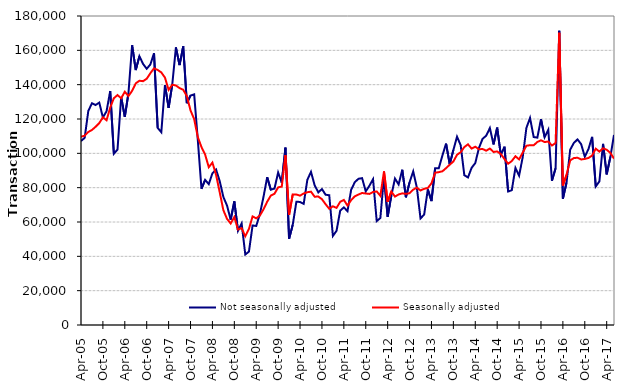
| Category | Not seasonally adjusted | Seasonally adjusted |
|---|---|---|
| 2005-04-01 | 107190 | 109680 |
| 2005-05-01 | 109010 | 110270 |
| 2005-06-01 | 124660 | 112460 |
| 2005-07-01 | 129170 | 113610 |
| 2005-08-01 | 128150 | 115470 |
| 2005-09-01 | 129560 | 117590 |
| 2005-10-01 | 120860 | 120990 |
| 2005-11-01 | 124540 | 119270 |
| 2005-12-01 | 136300 | 126640 |
| 2006-01-01 | 99740 | 132100 |
| 2006-02-01 | 102230 | 133940 |
| 2006-03-01 | 132710 | 132080 |
| 2006-04-01 | 121270 | 135880 |
| 2006-05-01 | 135030 | 133370 |
| 2006-06-01 | 162970 | 136400 |
| 2006-07-01 | 148490 | 140770 |
| 2006-08-01 | 156560 | 142280 |
| 2006-09-01 | 152100 | 142030 |
| 2006-10-01 | 149270 | 143440 |
| 2006-11-01 | 151770 | 146670 |
| 2006-12-01 | 158310 | 149510 |
| 2007-01-01 | 114880 | 148580 |
| 2007-02-01 | 112280 | 147120 |
| 2007-03-01 | 139780 | 144110 |
| 2007-04-01 | 126450 | 136980 |
| 2007-05-01 | 140110 | 139920 |
| 2007-06-01 | 161680 | 139530 |
| 2007-07-01 | 151390 | 137980 |
| 2007-08-01 | 162330 | 137040 |
| 2007-09-01 | 129210 | 133260 |
| 2007-10-01 | 133700 | 124980 |
| 2007-11-01 | 134320 | 119940 |
| 2007-12-01 | 107680 | 109440 |
| 2008-01-01 | 79350 | 103660 |
| 2008-02-01 | 84540 | 99300 |
| 2008-03-01 | 82050 | 91920 |
| 2008-04-01 | 88350 | 94610 |
| 2008-05-01 | 90570 | 87440 |
| 2008-06-01 | 83780 | 77280 |
| 2008-07-01 | 74560 | 66860 |
| 2008-08-01 | 69560 | 61820 |
| 2008-09-01 | 61330 | 59130 |
| 2008-10-01 | 72020 | 62890 |
| 2008-11-01 | 54910 | 55610 |
| 2008-12-01 | 59180 | 56400 |
| 2009-01-01 | 41060 | 51660 |
| 2009-02-01 | 42750 | 55930 |
| 2009-03-01 | 57990 | 63250 |
| 2009-04-01 | 57690 | 62120 |
| 2009-05-01 | 64640 | 63760 |
| 2009-06-01 | 74760 | 67390 |
| 2009-07-01 | 86090 | 71810 |
| 2009-08-01 | 78820 | 75400 |
| 2009-09-01 | 79480 | 76470 |
| 2009-10-01 | 88840 | 80170 |
| 2009-11-01 | 82910 | 80640 |
| 2009-12-01 | 103320 | 98940 |
| 2010-01-01 | 50230 | 64150 |
| 2010-02-01 | 58370 | 76080 |
| 2010-03-01 | 71830 | 76000 |
| 2010-04-01 | 71660 | 75360 |
| 2010-05-01 | 70560 | 76610 |
| 2010-06-01 | 84580 | 77340 |
| 2010-07-01 | 89190 | 77660 |
| 2010-08-01 | 81420 | 74740 |
| 2010-09-01 | 77250 | 74840 |
| 2010-10-01 | 79190 | 73270 |
| 2010-11-01 | 75890 | 70370 |
| 2010-12-01 | 75600 | 67700 |
| 2011-01-01 | 51900 | 69140 |
| 2011-02-01 | 54880 | 68230 |
| 2011-03-01 | 66600 | 71760 |
| 2011-04-01 | 68510 | 72870 |
| 2011-05-01 | 66340 | 69560 |
| 2011-06-01 | 78780 | 72780 |
| 2011-07-01 | 83180 | 74950 |
| 2011-08-01 | 85180 | 75980 |
| 2011-09-01 | 85530 | 76890 |
| 2011-10-01 | 77840 | 76610 |
| 2011-11-01 | 81110 | 76350 |
| 2011-12-01 | 84940 | 77470 |
| 2012-01-01 | 60530 | 77810 |
| 2012-02-01 | 62300 | 75240 |
| 2012-03-01 | 86720 | 89470 |
| 2012-04-01 | 63040 | 71730 |
| 2012-05-01 | 75350 | 77750 |
| 2012-06-01 | 85310 | 74800 |
| 2012-07-01 | 81880 | 76030 |
| 2012-08-01 | 90440 | 76690 |
| 2012-09-01 | 74390 | 76400 |
| 2012-10-01 | 83060 | 76770 |
| 2012-11-01 | 89450 | 78860 |
| 2012-12-01 | 80010 | 79990 |
| 2013-01-01 | 62060 | 78380 |
| 2013-02-01 | 64360 | 79340 |
| 2013-03-01 | 79000 | 79780 |
| 2013-04-01 | 72180 | 82520 |
| 2013-05-01 | 91270 | 88690 |
| 2013-06-01 | 91270 | 89040 |
| 2013-07-01 | 98710 | 89540 |
| 2013-08-01 | 105630 | 91380 |
| 2013-09-01 | 93680 | 93380 |
| 2013-10-01 | 101920 | 95230 |
| 2013-11-01 | 109670 | 99150 |
| 2013-12-01 | 104700 | 100660 |
| 2014-01-01 | 87280 | 103640 |
| 2014-02-01 | 85940 | 105230 |
| 2014-03-01 | 91570 | 102750 |
| 2014-04-01 | 94340 | 103850 |
| 2014-05-01 | 103110 | 102380 |
| 2014-06-01 | 108460 | 102520 |
| 2014-07-01 | 110280 | 101540 |
| 2014-08-01 | 114720 | 102790 |
| 2014-09-01 | 105170 | 100800 |
| 2014-10-01 | 114990 | 101110 |
| 2014-11-01 | 99010 | 99590 |
| 2014-12-01 | 103880 | 96680 |
| 2015-01-01 | 77750 | 93950 |
| 2015-02-01 | 78540 | 95500 |
| 2015-03-01 | 91490 | 98300 |
| 2015-04-01 | 86970 | 96460 |
| 2015-05-01 | 97800 | 100450 |
| 2015-06-01 | 114770 | 104410 |
| 2015-07-01 | 120610 | 104750 |
| 2015-08-01 | 109480 | 104680 |
| 2015-09-01 | 109160 | 106610 |
| 2015-10-01 | 119950 | 107590 |
| 2015-11-01 | 109370 | 106570 |
| 2015-12-01 | 113690 | 106870 |
| 2016-01-01 | 84030 | 104560 |
| 2016-02-01 | 91310 | 105990 |
| 2016-03-01 | 171370 | 170230 |
| 2016-04-01 | 73560 | 81240 |
| 2016-05-01 | 83000 | 87560 |
| 2016-06-01 | 102130 | 95920 |
| 2016-07-01 | 106040 | 97220 |
| 2016-08-01 | 108100 | 97460 |
| 2016-09-01 | 105370 | 96420 |
| 2016-10-01 | 98050 | 96740 |
| 2016-11-01 | 102430 | 97300 |
| 2016-12-01 | 109570 | 98670 |
| 2017-01-01 | 80680 | 102720 |
| 2017-02-01 | 83630 | 101000 |
| 2017-03-01 | 105550 | 102940 |
| 2017-04-01 | 87720 | 102090 |
| 2017-05-01 | 97830 | 100270 |
| 2017-06-01 | 110750 | 96910 |